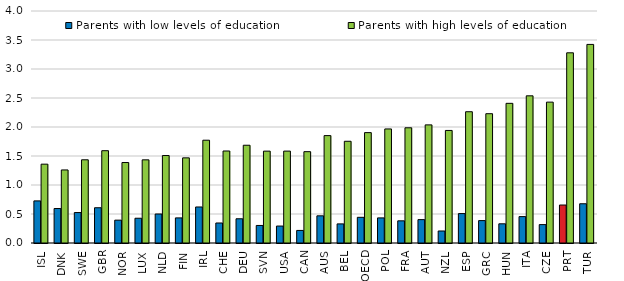
| Category | Parents with low levels of education | Parents with high levels of education |
|---|---|---|
| ISL | 0.726 | 1.359 |
| DNK | 0.594 | 1.259 |
| SWE | 0.525 | 1.435 |
| GBR | 0.608 | 1.591 |
| NOR | 0.394 | 1.387 |
| LUX | 0.427 | 1.434 |
| NLD | 0.5 | 1.508 |
| FIN | 0.433 | 1.468 |
| IRL | 0.621 | 1.772 |
| CHE | 0.345 | 1.586 |
| DEU | 0.418 | 1.686 |
| SVN | 0.302 | 1.584 |
| USA | 0.292 | 1.585 |
| CAN | 0.217 | 1.575 |
| AUS | 0.469 | 1.852 |
| BEL | 0.329 | 1.754 |
| OECD | 0.443 | 1.903 |
| POL | 0.433 | 1.967 |
| FRA | 0.382 | 1.986 |
| AUT | 0.403 | 2.036 |
| NZL | 0.207 | 1.941 |
| ESP | 0.507 | 2.263 |
| GRC | 0.386 | 2.229 |
| HUN | 0.331 | 2.408 |
| ITA | 0.455 | 2.538 |
| CZE | 0.317 | 2.429 |
| PRT | 0.655 | 3.279 |
| TUR | 0.677 | 3.424 |